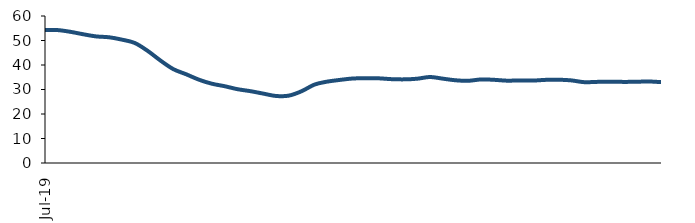
| Category | Series 0 |
|---|---|
| 2019-07-01 | 54.287 |
| 2019-08-01 | 54.245 |
| 2019-09-01 | 53.526 |
| 2019-10-01 | 52.526 |
| 2019-11-01 | 51.664 |
| 2019-12-01 | 51.311 |
| 2020-01-01 | 50.348 |
| 2020-02-01 | 48.978 |
| 2020-03-01 | 45.766 |
| 2020-04-01 | 41.808 |
| 2020-05-01 | 38.31 |
| 2020-06-01 | 36.214 |
| 2020-07-01 | 33.993 |
| 2020-08-01 | 32.365 |
| 2020-09-01 | 31.338 |
| 2020-10-01 | 30.13 |
| 2020-11-01 | 29.326 |
| 2020-12-01 | 28.333 |
| 2021-01-01 | 27.356 |
| 2021-02-01 | 27.502 |
| 2021-03-01 | 29.312 |
| 2021-04-01 | 32.007 |
| 2021-05-01 | 33.224 |
| 2021-06-01 | 33.927 |
| 2021-07-01 | 34.496 |
| 2021-08-01 | 34.565 |
| 2021-09-01 | 34.562 |
| 2021-10-01 | 34.221 |
| 2021-11-01 | 34.137 |
| 2021-12-01 | 34.397 |
| 2022-01-01 | 35.101 |
| 2022-02-01 | 34.424 |
| 2022-03-01 | 33.755 |
| 2022-04-01 | 33.56 |
| 2022-05-01 | 34.113 |
| 2022-06-01 | 33.948 |
| 2022-07-01 | 33.602 |
| 2022-08-01 | 33.71 |
| 2022-09-01 | 33.64 |
| 2022-10-01 | 33.931 |
| 2022-11-01 | 33.994 |
| 2022-12-01 | 33.725 |
| 2023-01-01 | 32.998 |
| 2023-02-01 | 33.108 |
| 2023-03-01 | 33.214 |
| 2023-04-01 | 33.11 |
| 2023-05-01 | 33.141 |
| 2023-06-01 | 33.274 |
| 2023-07-01 | 33.011 |